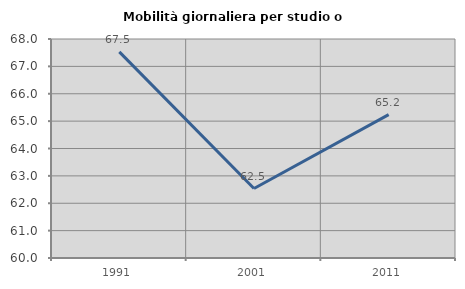
| Category | Mobilità giornaliera per studio o lavoro |
|---|---|
| 1991.0 | 67.529 |
| 2001.0 | 62.537 |
| 2011.0 | 65.238 |